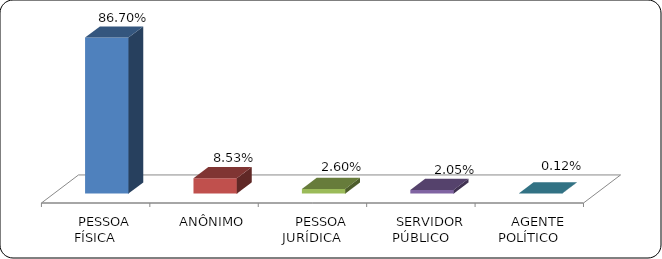
| Category | Series 0 |
|---|---|
|      PESSOA FÍSICA | 0.867 |
|      ANÔNIMO | 0.085 |
|      PESSOA JURÍDICA | 0.026 |
|      SERVIDOR PÚBLICO | 0.02 |
|      AGENTE POLÍTICO | 0.001 |